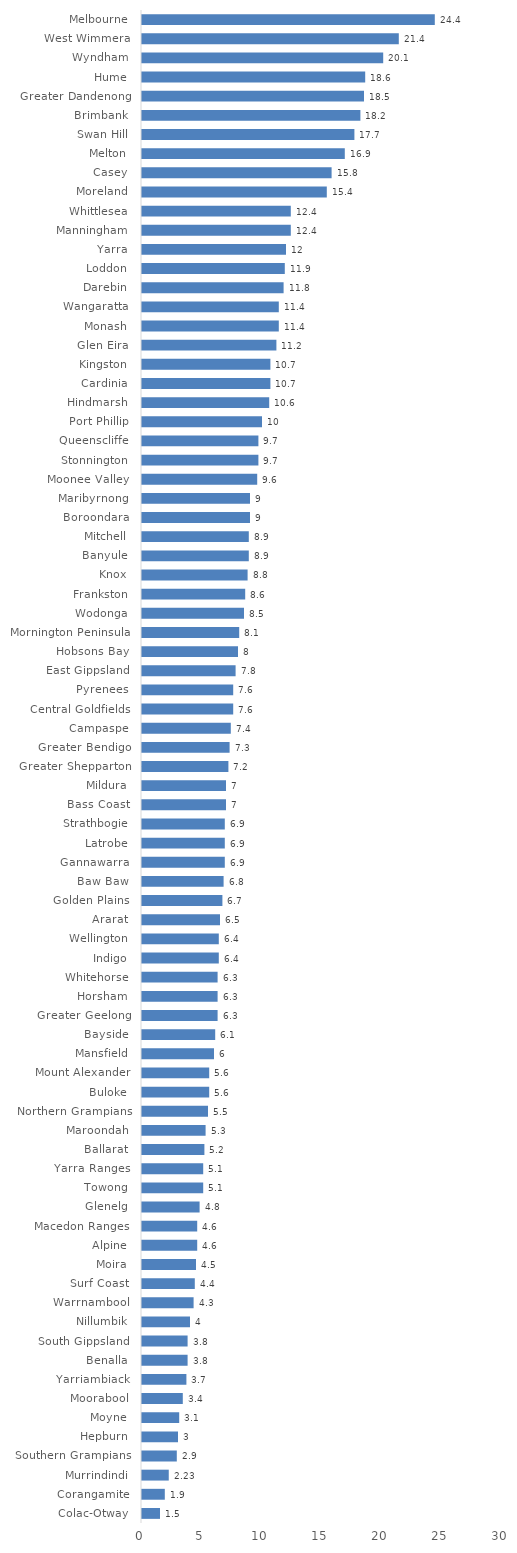
| Category | Series 0 |
|---|---|
| Colac-Otway  | 1.5 |
| Corangamite  | 1.9 |
| Murrindindi  | 2.23 |
| Southern Grampians  | 2.9 |
| Hepburn  | 3 |
| Moyne  | 3.1 |
| Moorabool  | 3.4 |
| Yarriambiack  | 3.7 |
| Benalla  | 3.8 |
| South Gippsland  | 3.8 |
| Nillumbik  | 4 |
| Warrnambool  | 4.3 |
| Surf Coast  | 4.4 |
| Moira  | 4.5 |
| Alpine  | 4.6 |
| Macedon Ranges  | 4.6 |
| Glenelg  | 4.8 |
| Towong  | 5.1 |
| Yarra Ranges  | 5.1 |
| Ballarat  | 5.2 |
| Maroondah  | 5.3 |
| Northern Grampians  | 5.5 |
| Buloke  | 5.6 |
| Mount Alexander  | 5.6 |
| Mansfield  | 6 |
| Bayside  | 6.1 |
| Greater Geelong  | 6.3 |
| Horsham  | 6.3 |
| Whitehorse  | 6.3 |
| Indigo  | 6.4 |
| Wellington  | 6.4 |
| Ararat  | 6.5 |
| Golden Plains  | 6.7 |
| Baw Baw  | 6.8 |
| Gannawarra  | 6.9 |
| Latrobe  | 6.9 |
| Strathbogie  | 6.9 |
| Bass Coast  | 7 |
| Mildura  | 7 |
| Greater Shepparton  | 7.2 |
| Greater Bendigo  | 7.3 |
| Campaspe  | 7.4 |
| Central Goldfields  | 7.6 |
| Pyrenees  | 7.6 |
| East Gippsland  | 7.8 |
| Hobsons Bay  | 8 |
| Mornington Peninsula  | 8.1 |
| Wodonga  | 8.5 |
| Frankston  | 8.6 |
| Knox  | 8.8 |
| Banyule  | 8.9 |
| Mitchell  | 8.9 |
| Boroondara  | 9 |
| Maribyrnong  | 9 |
| Moonee Valley  | 9.6 |
| Stonnington  | 9.7 |
| Queenscliffe  | 9.7 |
| Port Phillip  | 10 |
| Hindmarsh  | 10.6 |
| Cardinia  | 10.7 |
| Kingston  | 10.7 |
| Glen Eira  | 11.2 |
| Monash  | 11.4 |
| Wangaratta  | 11.4 |
| Darebin  | 11.8 |
| Loddon  | 11.9 |
| Yarra  | 12 |
| Manningham  | 12.4 |
| Whittlesea  | 12.4 |
| Moreland  | 15.4 |
| Casey  | 15.8 |
| Melton  | 16.9 |
| Swan Hill  | 17.7 |
| Brimbank  | 18.2 |
| Greater Dandenong  | 18.5 |
| Hume  | 18.6 |
| Wyndham  | 20.1 |
| West Wimmera  | 21.4 |
| Melbourne  | 24.4 |